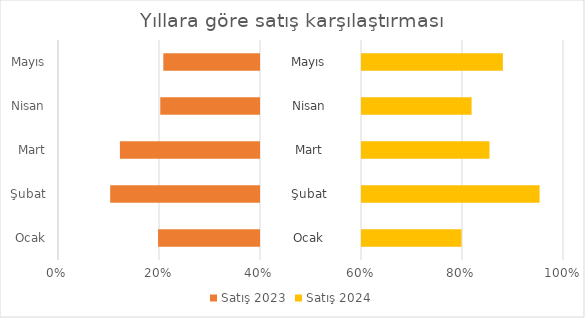
| Category | Sol boşluk | Satış 2023 | Orta boşluk | Satış 2024 | Sağ boşluk |
|---|---|---|---|---|---|
| Ocak | 24768 | 25232 | 25000 | 24872 | 25128 |
| Şubat | 12916 | 37084 | 25000 | 44204 | 5796 |
| Mart | 15321 | 34679 | 25000 | 31798 | 18202 |
| Nisan | 25313 | 24687 | 25000 | 27372 | 22628 |
| Mayıs | 26070 | 23930 | 25000 | 35115 | 14885 |